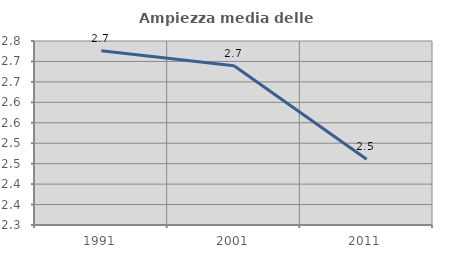
| Category | Ampiezza media delle famiglie |
|---|---|
| 1991.0 | 2.726 |
| 2001.0 | 2.689 |
| 2011.0 | 2.461 |